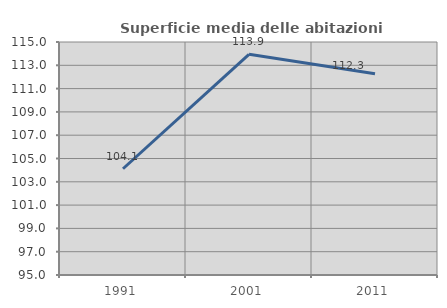
| Category | Superficie media delle abitazioni occupate |
|---|---|
| 1991.0 | 104.119 |
| 2001.0 | 113.944 |
| 2011.0 | 112.277 |